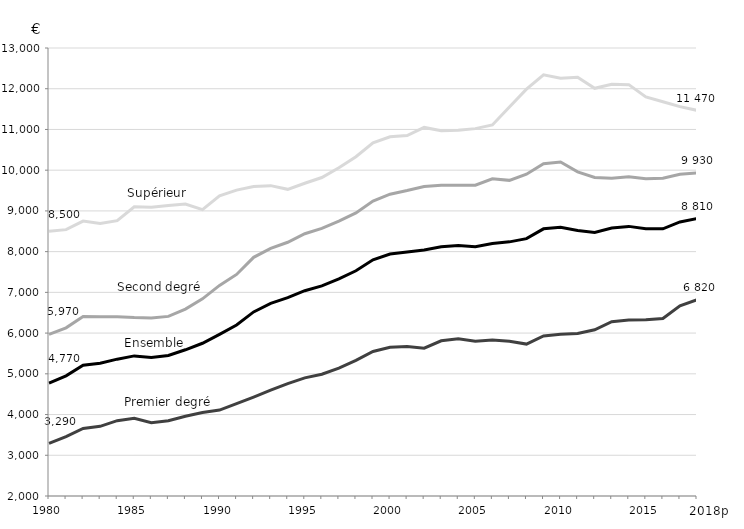
| Category | Premier degré | Second degré | Supérieur | Ensemble |
|---|---|---|---|---|
| 1980 | 3290 | 5970 | 8500 | 4770 |
| 1981 | 3460 | 6130 | 8540 | 4950 |
| 1982 | 3660 | 6410 | 8750 | 5210 |
| 1983 | 3710 | 6400 | 8690 | 5260 |
| 1984 | 3850 | 6400 | 8760 | 5360 |
| 1985 | 3910 | 6380 | 9100 | 5440 |
| 1986 | 3800 | 6370 | 9090 | 5400 |
| 1987 | 3850 | 6410 | 9130 | 5450 |
| 1988 | 3960 | 6590 | 9170 | 5590 |
| 1989 | 4050 | 6840 | 9030 | 5750 |
| 1990 | 4110 | 7170 | 9370 | 5970 |
| 1991 | 4270 | 7440 | 9510 | 6200 |
| 1992 | 4430 | 7860 | 9600 | 6520 |
| 1993 | 4600 | 8080 | 9620 | 6730 |
| 1994 | 4760 | 8230 | 9530 | 6870 |
| 1995 | 4900 | 8440 | 9680 | 7040 |
| 1996 | 4990 | 8570 | 9820 | 7160 |
| 1997 | 5140 | 8750 | 10060 | 7330 |
| 1998 | 5330 | 8950 | 10330 | 7530 |
| 1999 | 5550 | 9240 | 10670 | 7800 |
| 2000 | 5650 | 9410 | 10820 | 7940 |
| 2001 | 5670 | 9500 | 10850 | 7990 |
| 2002 | 5630 | 9600 | 11050 | 8040 |
| 2003 | 5810 | 9630 | 10970 | 8120 |
| 2004 | 5860 | 9630 | 10980 | 8150 |
| 2005 | 5800 | 9630 | 11020 | 8120 |
| 2006 | 5830 | 9790 | 11110 | 8200 |
| 2007 | 5800 | 9750 | 11550 | 8240 |
| 2008 | 5730 | 9900 | 11990 | 8320 |
| 2009 | 5930 | 10160 | 12340 | 8560 |
| 2010 | 5970 | 10200 | 12260 | 8600 |
| 2011 | 5990 | 9960 | 12280 | 8520 |
| 2012 | 6080 | 9820 | 12010 | 8470 |
| 2013 | 6280 | 9800 | 12110 | 8580 |
| 2014 | 6320 | 9840 | 12100 | 8620 |
| 2015 | 6330 | 9790 | 11800 | 8560 |
| 2016 | 6360 | 9800 | 11680 | 8560 |
| 2017 | 6670 | 9900 | 11560 | 8730 |
| 2018 (p) | 6820 | 9930 | 11470 | 8810 |